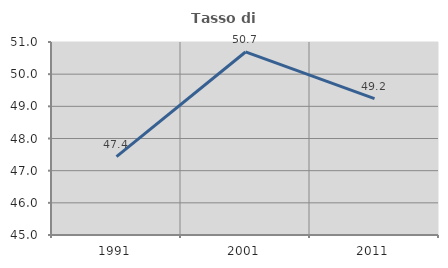
| Category | Tasso di occupazione   |
|---|---|
| 1991.0 | 47.436 |
| 2001.0 | 50.69 |
| 2011.0 | 49.24 |